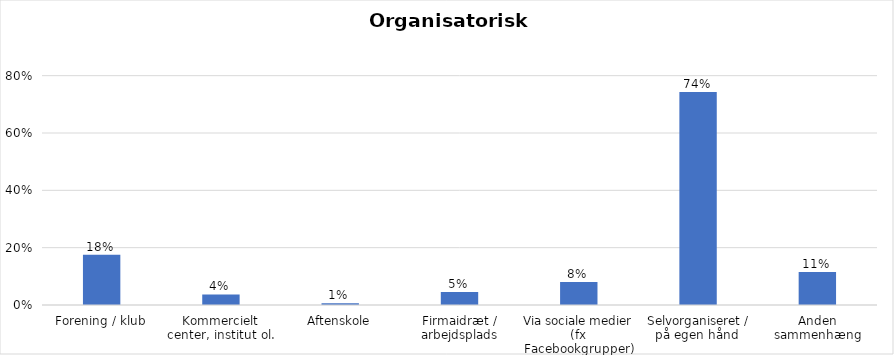
| Category | % |
|---|---|
| Forening / klub | 0.175 |
| Kommercielt center, institut ol. | 0.037 |
| Aftenskole | 0.006 |
| Firmaidræt / arbejdsplads | 0.045 |
| Via sociale medier (fx Facebookgrupper) | 0.08 |
| Selvorganiseret / på egen hånd  | 0.743 |
| Anden sammenhæng | 0.115 |